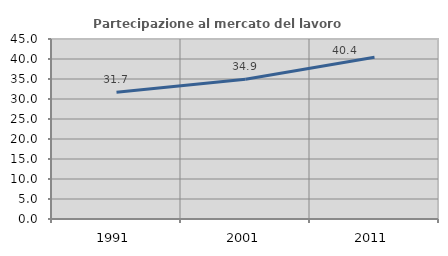
| Category | Partecipazione al mercato del lavoro  femminile |
|---|---|
| 1991.0 | 31.674 |
| 2001.0 | 34.917 |
| 2011.0 | 40.438 |